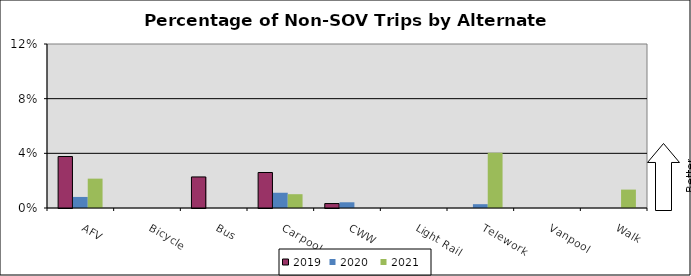
| Category | 2019 | 2020 | 2021 |
|---|---|---|---|
| AFV | 0.038 | 0.008 | 0.021 |
| Bicycle | 0 | 0 | 0 |
| Bus | 0.023 | 0 | 0 |
| Carpool | 0.026 | 0.011 | 0.01 |
| CWW | 0.003 | 0.004 | 0 |
| Light Rail | 0 | 0 | 0 |
| Telework | 0 | 0.003 | 0.04 |
| Vanpool | 0 | 0 | 0 |
| Walk | 0 | 0 | 0.013 |